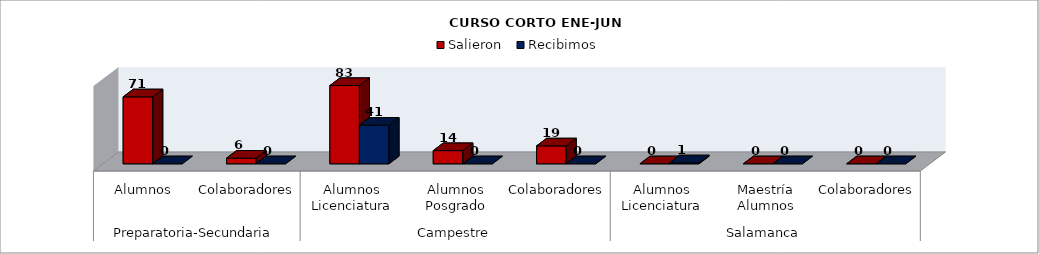
| Category | Salieron  | Recibimos |
|---|---|---|
| 0 | 71 | 0 |
| 1 | 6 | 0 |
| 2 | 83 | 41 |
| 3 | 14 | 0 |
| 4 | 19 | 0 |
| 5 | 0 | 1 |
| 6 | 0 | 0 |
| 7 | 0 | 0 |